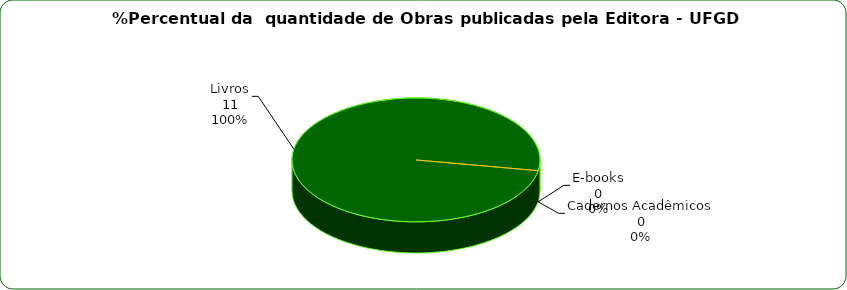
| Category | Series 0 |
|---|---|
| 0 | 0 |
| 1 | 11 |
| 2 | 0 |